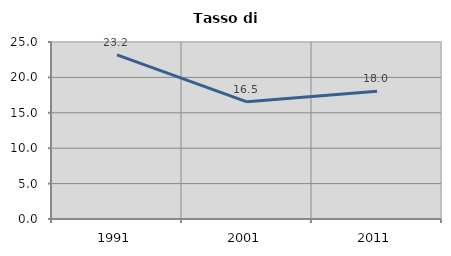
| Category | Tasso di disoccupazione   |
|---|---|
| 1991.0 | 23.17 |
| 2001.0 | 16.548 |
| 2011.0 | 18.041 |